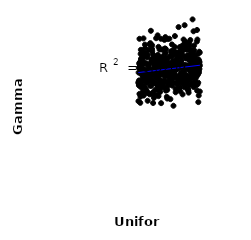
| Category | Series 0 |
|---|---|
| 151.58662230469125 | 69.501 |
| 117.02366175498116 | 64.762 |
| 141.4622938112055 | 52.616 |
| 140.04481939467075 | 70.522 |
| 138.54682849161816 | 66.701 |
| 114.3937213328714 | 60.175 |
| 111.9688835244239 | 63.059 |
| 154.23147277150008 | 69.711 |
| 108.42089313407557 | 56.748 |
| 121.60663631891065 | 62.64 |
| 137.001413410114 | 62.408 |
| 153.71407965694323 | 61.206 |
| 130.953628019818 | 64.091 |
| 137.8433108642392 | 58.861 |
| 114.67230462280449 | 67.638 |
| 139.254163358308 | 58.27 |
| 149.5701239956246 | 62.541 |
| 133.52875895147798 | 55.281 |
| 145.3219372055374 | 68.757 |
| 141.1928729245958 | 59.076 |
| 133.86503710598365 | 57.231 |
| 132.29333464374923 | 71.035 |
| 128.93570748829694 | 62.601 |
| 126.15059682240863 | 57.267 |
| 158.08882277802542 | 66.925 |
| 149.08031780903394 | 53.04 |
| 136.3329241079614 | 60.275 |
| 116.41255291665382 | 60.231 |
| 115.49649882743664 | 60.181 |
| 132.06005435090202 | 60.922 |
| 126.00508338681331 | 76.265 |
| 156.80155260295928 | 66.309 |
| 108.78196619002767 | 58.007 |
| 151.808604515911 | 70.137 |
| 123.06967446008183 | 65.987 |
| 106.119097633572 | 59.214 |
| 153.45562445195057 | 71.399 |
| 103.47065402841946 | 67.418 |
| 122.478109245833 | 57.234 |
| 140.60853881658528 | 69.288 |
| 146.70241842897883 | 60.218 |
| 123.92320524545396 | 62.994 |
| 134.06616891283485 | 71.371 |
| 148.60029297280818 | 57.171 |
| 124.88792561904154 | 61.937 |
| 116.85124174958747 | 59.686 |
| 159.60431633918424 | 70.842 |
| 132.47978972670376 | 63.618 |
| 147.92368566363774 | 63.222 |
| 107.35222295221547 | 72.498 |
| 155.34974182683015 | 65.535 |
| 122.96729861850233 | 57.507 |
| 146.87760657206462 | 56.341 |
| 151.44616522288106 | 59.072 |
| 143.60598700343752 | 51.238 |
| 127.3651615808546 | 52.982 |
| 146.13990437948104 | 57.047 |
| 122.13348809732918 | 64.421 |
| 146.3784054526746 | 74.016 |
| 141.87764462293603 | 61.157 |
| 121.03890436650336 | 65.063 |
| 140.9531317034082 | 73.023 |
| 125.52298814488245 | 57.179 |
| 101.32036258354088 | 55.536 |
| 109.46405868303056 | 51.887 |
| 150.81827046183284 | 63.567 |
| 148.25156817429348 | 68.484 |
| 124.29297364957225 | 67.283 |
| 121.47852402757475 | 68.231 |
| 109.98323734713952 | 59.926 |
| 149.7029855441926 | 67.373 |
| 105.4213727370216 | 57.3 |
| 138.2397512346903 | 67.876 |
| 101.08416524071903 | 61.299 |
| 125.84143945363542 | 60.69 |
| 135.90676135191632 | 60.393 |
| 119.35167467539978 | 65.432 |
| 135.36683302019281 | 69.705 |
| 121.93522390675261 | 52.399 |
| 128.16302346775868 | 56.795 |
| 120.30478521486637 | 50.44 |
| 148.55841964791068 | 69.282 |
| 139.4502643846024 | 57.38 |
| 124.57215566175644 | 56.298 |
| 155.64808240936648 | 58.145 |
| 118.53541247721753 | 56.263 |
| 151.02805538598574 | 76.227 |
| 115.71544281627449 | 56.546 |
| 132.82479306592532 | 60.112 |
| 129.536856654268 | 64.173 |
| 122.81125549736561 | 47.223 |
| 155.228358779723 | 68.151 |
| 117.45102276058799 | 65.885 |
| 130.78695648682475 | 76.805 |
| 132.42606245281831 | 58.148 |
| 154.66718948064377 | 73.683 |
| 122.06993177993553 | 60.319 |
| 122.67616287322589 | 64.292 |
| 119.07411628484087 | 61.824 |
| 121.13209332623866 | 64.695 |
| 115.0139581605669 | 52.256 |
| 137.30645537757508 | 62.597 |
| 100.91505817604192 | 48.13 |
| 158.91759964178874 | 67.328 |
| 147.45121055679738 | 64.683 |
| 155.90770291185535 | 61.067 |
| 138.12092981468908 | 69.269 |
| 132.11321418604717 | 64.754 |
| 133.10942454992232 | 60.616 |
| 101.88301232729307 | 51.482 |
| 157.27943849399426 | 63.192 |
| 125.75855081140696 | 66.746 |
| 126.89507557119879 | 77.567 |
| 144.94898320540008 | 64.855 |
| 155.75660786086172 | 69.006 |
| 141.65303355792307 | 57.835 |
| 105.91227618221703 | 50.693 |
| 122.35931852301326 | 65.353 |
| 130.08984277217016 | 57.101 |
| 128.75371361528977 | 53.31 |
| 148.34442213449796 | 59.715 |
| 103.22824038175337 | 71.712 |
| 139.5710368196299 | 56.564 |
| 106.19866203186267 | 61.113 |
| 134.2120527561547 | 66.643 |
| 136.60954237848986 | 70.075 |
| 140.8848481051661 | 64.792 |
| 149.44990854988134 | 74.654 |
| 103.5689535632133 | 57.54 |
| 112.2997307194285 | 59.367 |
| 102.05105420367123 | 63.198 |
| 135.13016491669896 | 65.38 |
| 121.72947291574019 | 55.579 |
| 114.1551923159175 | 73.819 |
| 117.58176020153672 | 63.171 |
| 111.1400867732507 | 71.72 |
| 127.99551988690257 | 60.575 |
| 145.1483697699441 | 64.073 |
| 159.54139163875584 | 66.689 |
| 142.59061412825744 | 66.992 |
| 141.9661062080536 | 66.523 |
| 154.03751815755416 | 61.346 |
| 115.99678716196627 | 63.484 |
| 117.06658627419644 | 68.689 |
| 136.98948004400904 | 64.43 |
| 129.86160509755555 | 59.51 |
| 159.94007260290758 | 66.109 |
| 158.36219606811042 | 60.339 |
| 119.19823053475498 | 53.463 |
| 101.69453446313864 | 55.292 |
| 131.20136207194668 | 59.311 |
| 106.77153111670388 | 54.879 |
| 119.21344259147436 | 51.055 |
| 132.62171707444702 | 64.422 |
| 107.97320202730913 | 58.974 |
| 130.54458588030832 | 62.41 |
| 132.76617391594007 | 68.944 |
| 158.75161663415227 | 47.699 |
| 149.2884276524941 | 67.661 |
| 142.67087117525335 | 70.355 |
| 128.776727026537 | 49.336 |
| 129.21576255670442 | 67.804 |
| 110.45973454655338 | 61.932 |
| 118.82158931655852 | 67.374 |
| 155.14307975481117 | 58.713 |
| 102.86289483667758 | 50.21 |
| 106.80786533695773 | 59.556 |
| 136.1520624337956 | 78.028 |
| 107.98709582020662 | 53.773 |
| 145.5447384408859 | 83.014 |
| 111.63172470300597 | 74.258 |
| 131.94282466953655 | 64.923 |
| 151.24526971229176 | 64.361 |
| 131.28352207647904 | 58.22 |
| 108.10698876845873 | 70.493 |
| 142.384537806102 | 68.907 |
| 147.0275089056367 | 55.689 |
| 111.86127096988542 | 60.323 |
| 159.6935308827816 | 65.398 |
| 124.6394364896577 | 61.38 |
| 101.22856795476362 | 63.488 |
| 154.48824002221357 | 62.855 |
| 102.6796128498152 | 47.371 |
| 151.42501608394292 | 67.918 |
| 116.47485469041813 | 66.127 |
| 143.31454226873524 | 61.074 |
| 131.5837180520668 | 55.981 |
| 151.9843090168883 | 60.833 |
| 146.9865219846219 | 67.684 |
| 124.74114544179774 | 64.711 |
| 139.8854285622441 | 59.397 |
| 104.87799833020475 | 54.294 |
| 117.68353442510812 | 56.472 |
| 136.86849508829016 | 52.212 |
| 126.1163610059692 | 57.559 |
| 102.75886771905466 | 56.86 |
| 108.88307221430803 | 57.875 |
| 104.28604480401643 | 66.058 |
| 119.69164034931637 | 69.394 |
| 146.55896577170574 | 71.923 |
| 108.57910453380097 | 65.534 |
| 112.55155848390957 | 57.822 |
| 150.66865035448015 | 66.687 |
| 144.0391511356472 | 59.896 |
| 148.97475151033112 | 53.236 |
| 120.06832395483562 | 54.604 |
| 135.52565173964638 | 60.141 |
| 105.13433688975967 | 52.439 |
| 156.68898704405944 | 65.513 |
| 107.4641051427658 | 62.14 |
| 115.88266439122606 | 49.658 |
| 105.52040745329293 | 65.156 |
| 159.27073215997785 | 62.056 |
| 144.82081853217642 | 59.273 |
| 137.40536454544448 | 63.508 |
| 145.03690880720325 | 74.129 |
| 149.41157461268003 | 52.045 |
| 130.34523707450177 | 65.073 |
| 120.58227557123203 | 59.526 |
| 153.53704914871014 | 59.236 |
| 104.10844050002189 | 51.431 |
| 157.7528754016516 | 61.081 |
| 125.33114210948762 | 63.413 |
| 156.3529066017246 | 62.123 |
| 101.60911180769003 | 65.537 |
| 147.86053559737093 | 71.84 |
| 146.00756736160918 | 64.481 |
| 101.04794908447339 | 57.05 |
| 102.44019355268856 | 66.074 |
| 140.36443142746202 | 63.307 |
| 111.33051793177951 | 62.155 |
| 121.36159193319575 | 53.685 |
| 113.7613741652395 | 56.971 |
| 133.9451738078719 | 65.977 |
| 106.02010013860895 | 60.589 |
| 151.72344877473142 | 59.615 |
| 112.16403177068868 | 55.205 |
| 156.03836996703842 | 56.647 |
| 145.89173439174172 | 75.597 |
| 124.18675312598836 | 68.647 |
| 146.54204203601066 | 58.873 |
| 152.53815283697418 | 67.885 |
| 148.76331314143061 | 53.759 |
| 109.04998482882917 | 56.676 |
| 116.31731616096403 | 56.625 |
| 144.32363249311416 | 55.98 |
| 125.10962526140716 | 54.664 |
| 106.64842911444917 | 59.279 |
| 159.15405430744212 | 50.724 |
| 115.0645010266322 | 47.287 |
| 128.63451063854936 | 65.53 |
| 107.02497617564624 | 61.017 |
| 156.9987948611144 | 55.49 |
| 108.62918196361302 | 57.918 |
| 112.83413286802195 | 73.911 |
| 104.47012626205924 | 62.794 |
| 157.99229981088854 | 55.865 |
| 103.44378169799246 | 67.588 |
| 143.91208676304097 | 71.572 |
| 134.3313529445006 | 65.073 |
| 117.98666725209506 | 77.032 |
| 127.47301114547506 | 72.004 |
| 144.5896295935416 | 58.293 |
| 159.39517808076454 | 61.221 |
| 123.80702717776896 | 54.45 |
| 126.42959940760788 | 61.803 |
| 152.87164305397562 | 62.191 |
| 152.29694889991072 | 65.159 |
| 138.00267017168446 | 64.397 |
| 147.71734470011177 | 67.878 |
| 128.51313228624704 | 64.143 |
| 134.54359247682183 | 59.804 |
| 154.32031144387088 | 54.618 |
| 113.28330038448901 | 67.315 |
| 137.80695574385007 | 70.562 |
| 117.84844435556225 | 58.676 |
| 150.49166413547758 | 64.578 |
| 154.73209927270094 | 71.493 |
| 104.2376494493162 | 66.973 |
| 112.40763091253643 | 74.784 |
| 137.15571214418208 | 56.362 |
| 118.33784833503339 | 56.025 |
| 119.5955484436477 | 65.021 |
| 145.82470642191197 | 72.08 |
| 140.1284742937491 | 59.005 |
| 111.23096308346372 | 61.654 |
| 137.56502878816124 | 63.67 |
| 156.1489961637179 | 63.231 |
| 153.0476929972122 | 59 |
| 129.81572902736866 | 55.444 |
| 113.58554847370158 | 51.463 |
| 155.50730411764897 | 57.174 |
| 133.0084179979695 | 69.524 |
| 124.42445230178612 | 60.77 |
| 130.5628502262545 | 63.799 |
| 129.27961320887624 | 62.106 |
| 116.77300861772481 | 64.264 |
| 145.66337480132063 | 54.513 |
| 157.39693064652494 | 75.531 |
| 117.38904242688703 | 53.406 |
| 142.1092193065715 | 60.034 |
| 140.28163999942444 | 65.452 |
| 156.26547448980057 | 63.366 |
| 110.30207943499673 | 61.014 |
| 111.77780769575556 | 51.288 |
| 114.0277222666988 | 72.111 |
| 126.55467154412975 | 72.365 |
| 112.92803273654502 | 80.453 |
| 121.3219741327282 | 71.855 |
| 107.68848305174687 | 70.19 |
| 124.09846688490065 | 66.19 |
| 127.57820745678903 | 63.64 |
| 151.11223722579598 | 61.914 |
| 127.25711718678212 | 59.593 |
| 160.21212414338694 | 52.594 |
| 157.5807296088554 | 52.959 |
| 153.63560264320523 | 65.238 |
| 105.24904382990684 | 67.815 |
| 139.67386949895698 | 82.156 |
| 110.53294410956296 | 57.312 |
| 136.75285838885887 | 53.76 |
| 122.2791391047895 | 67.209 |
| 107.13900301049422 | 62.699 |
| 142.87093370320554 | 60.426 |
| 150.9564026856488 | 58.46 |
| 118.18104156315579 | 64.529 |
| 109.17230062886117 | 52.73 |
| 104.64034460247964 | 71.447 |
| 126.79550516487502 | 66.632 |
| 139.36550932020913 | 66.514 |
| 160.29622896288313 | 64.493 |
| 105.78567793830594 | 76.958 |
| 134.74617732943744 | 46.03 |
| 145.37232889053607 | 62.133 |
| 105.10596108749243 | 59.258 |
| 126.33124544354123 | 59.495 |
| 102.60881562177009 | 60.992 |
| 119.46878053485322 | 78.362 |
| 149.93175665177935 | 75.149 |
| 110.83035748654902 | 61.411 |
| 107.77419841570267 | 59.453 |
| 136.4052242056436 | 59.181 |
| 123.23896351718153 | 57.204 |
| 114.24452763335383 | 71.097 |
| 131.76861393798447 | 49.072 |
| 107.55582615494724 | 69.297 |
| 129.06013732826926 | 76.658 |
| 104.96475109804864 | 59.932 |
| 103.71764463433149 | 63.979 |
| 129.38761179714595 | 55.81 |
| 135.7655967740438 | 60.065 |
| 130.20564357990847 | 60.955 |
| 143.0583238002518 | 60.927 |
| 113.65190798189187 | 58.029 |
| 147.24214385874808 | 72.966 |
| 127.68945741557755 | 67.912 |
| 110.05077182357688 | 57.708 |
| 111.47410734029 | 61.872 |
| 144.7468743446619 | 61.795 |
| 140.49461559573353 | 59.472 |
| 154.78871300727127 | 63.498 |
| 126.70243908488268 | 69.997 |
| 102.35081454672367 | 61.234 |
| 118.8589709959806 | 55.954 |
| 119.93668697865635 | 66.935 |
| 109.3959294442267 | 69.089 |
| 108.28461498144982 | 57.376 |
| 118.10521154139062 | 63.055 |
| 120.93778052240876 | 56.262 |
| 128.07025951557358 | 65.955 |
| 143.7701203972768 | 63.528 |
| 146.19441788135978 | 74.718 |
| 113.1650306007471 | 66.05 |
| 123.6115791056186 | 60.487 |
| 157.8745912145891 | 76.443 |
| 156.5484873110769 | 59.451 |
| 131.63963301159492 | 62.357 |
| 114.80220923590637 | 67.86 |
| 114.62121778162589 | 69.826 |
| 120.77454349574222 | 57.889 |
| 147.6186638774323 | 68.602 |
| 150.1463628490374 | 62.914 |
| 152.2484317897543 | 62.688 |
| 106.48612226990446 | 68.743 |
| 150.4299285502329 | 58.066 |
| 144.26431310533522 | 62.255 |
| 150.35971317143628 | 73.556 |
| 158.6974988748694 | 56.641 |
| 148.92898590063584 | 68.319 |
| 157.50831459150936 | 80.825 |
| 135.0181373441298 | 71.215 |
| 156.93667812320317 | 59.28 |
| 158.45511147702675 | 61.908 |
| 139.02859565882613 | 68.175 |
| 119.85268870466415 | 65.866 |
| 131.1009957465014 | 68.736 |
| 137.6056910511817 | 67.231 |
| 115.23888006022929 | 51.402 |
| 150.02024714200834 | 55.468 |
| 116.6158793013185 | 67.524 |
| 147.3275757038689 | 68.248 |
| 144.51295304435016 | 76.444 |
| 120.45262949445853 | 60.818 |
| 122.59311037322384 | 76.786 |
| 133.57342079348146 | 62.916 |
| 155.47526846476157 | 67.82 |
| 103.02822195574325 | 69.848 |
| 125.20649303362782 | 66.123 |
| 130.06513050254688 | 64.43 |
| 127.09159191908594 | 61.789 |
| 143.12979572914122 | 56.532 |
| 110.15400909020207 | 64.391 |
| 103.90508812927136 | 55.785 |
| 144.07777879586035 | 59.748 |
| 136.17149731797883 | 65.646 |
| 120.26732592557612 | 73.079 |
| 142.1964014014985 | 65.13 |
| 158.54974015874717 | 69.903 |
| 136.03761790209688 | 73.095 |
| 123.66827226267134 | 61.478 |
| 127.06626873033225 | 70.361 |
| 128.34196304893976 | 50.135 |
| 125.61807000545625 | 63.04 |
| 129.67341180010072 | 65.915 |
| 139.00331950827606 | 55.975 |
| 101.50828724259983 | 57.672 |
| 138.63351831455532 | 53.995 |
| 106.42015807313234 | 65.817 |
| 152.48520021992465 | 67.368 |
| 109.24573995488741 | 68.327 |
| 159.84102411591672 | 62.966 |
| 110.985021147687 | 58.793 |
| 107.1912950388027 | 74.089 |
| 134.45694894852227 | 60.515 |
| 133.2833173209676 | 74.184 |
| 148.05696951957177 | 64.062 |
| 102.14001328684107 | 65.076 |
| 135.28899070257353 | 62.066 |
| 117.20999380807285 | 61.245 |
| 112.12758220326295 | 62.202 |
| 160.12562660770496 | 70.431 |
| 103.99366580256924 | 62.655 |
| 123.46974115257154 | 71.838 |
| 112.7522488364373 | 61.787 |
| 113.45220437073755 | 55.156 |
| 109.61381818136765 | 69.39 |
| 133.39255852528572 | 68.856 |
| 113.86878123056306 | 67.203 |
| 118.4244474708811 | 59.675 |
| 127.90693169564949 | 54.216 |
| 118.65877319586109 | 55.777 |
| 134.85049961008332 | 63.325 |
| 109.8146217131971 | 48.32 |
| 110.93597949009887 | 64.802 |
| 154.133288250195 | 80.222 |
| 115.28641292545042 | 56.924 |
| 124.98100499773757 | 71.785 |
| 133.71968818955122 | 61.468 |
| 116.18870199958438 | 60.913 |
| 115.58974311402267 | 66.954 |
| 142.8313665131555 | 64.032 |
| 152.9873219957528 | 55.916 |
| 141.655485513751 | 59.6 |
| 140.80085821025432 | 59.888 |
| 158.9978746874084 | 63.615 |
| 153.9124165858309 | 55.279 |
| 153.21393757465518 | 85.688 |
| 130.8156326240508 | 65.272 |
| 135.63255841927827 | 65.868 |
| 134.6599320726978 | 58.988 |
| 131.497717861565 | 58.13 |
| 141.10770189731986 | 72.695 |
| 158.2017888228091 | 62.433 |
| 143.38405014880067 | 73.673 |
| 115.84104618292596 | 65.078 |
| 154.99102990417504 | 66.487 |
| 114.44773724926691 | 57.698 |
| 139.85637213356705 | 64.206 |
| 113.06065818990056 | 61.545 |
| 138.68459857839792 | 67.718 |
| 141.40485132590544 | 54.408 |
| 143.50031847637285 | 56.861 |
| 120.70661390607273 | 56.29 |
| 152.67601946282235 | 56.361 |
| 138.83872287396488 | 65.355 |
| 110.68526655767339 | 62.439 |
| 149.7921941294483 | 71.817 |
| 157.15596714708624 | 66.389 |
| 123.35033816146063 | 65.093 |
| 100.81924212561586 | 56.503 |
| 104.62970817655639 | 68.61 |
| 109.69654503252855 | 60.652 |
| 152.0805110895086 | 71.618 |
| 148.19488730427543 | 58.68 |
| 103.14635247879926 | 54.678 |
| 101.91168156142298 | 76.776 |
| 138.3579234098986 | 66.543 |
| 105.67333771855652 | 69.87 |
| 153.29515834708843 | 70.079 |
| 142.36540023738291 | 57.234 |